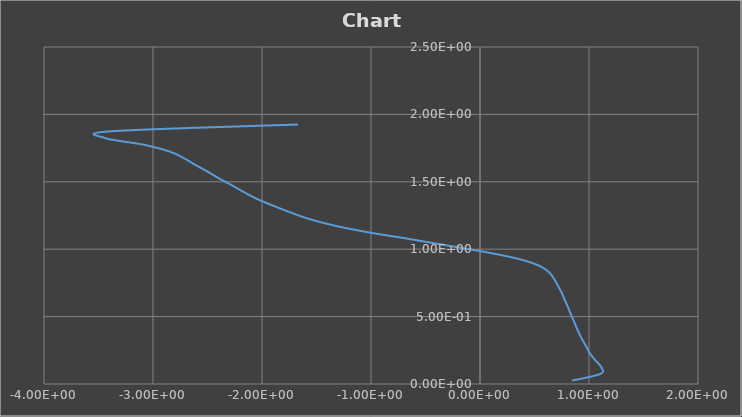
| Category | Series 0 |
|---|---|
| 0.8444 | 0.025 |
| 1.106 | 0.075 |
| 1.113 | 0.125 |
| 1.059 | 0.175 |
| 1.01 | 0.225 |
| 0.9769 | 0.275 |
| 0.9414 | 0.325 |
| 0.9095 | 0.375 |
| 0.8822 | 0.425 |
| 0.8566 | 0.475 |
| 0.8299 | 0.525 |
| 0.8045 | 0.575 |
| 0.7765 | 0.625 |
| 0.7507 | 0.675 |
| 0.7172 | 0.725 |
| 0.6835 | 0.775 |
| 0.638 | 0.825 |
| 0.5493 | 0.875 |
| 0.3674 | 0.925 |
| 0.07627 | 0.975 |
| -0.2831 | 1.025 |
| -0.6416 | 1.075 |
| -1.023 | 1.125 |
| -1.336 | 1.175 |
| -1.571 | 1.225 |
| -1.746 | 1.275 |
| -1.905 | 1.325 |
| -2.052 | 1.375 |
| -2.169 | 1.425 |
| -2.278 | 1.475 |
| -2.394 | 1.525 |
| -2.498 | 1.575 |
| -2.611 | 1.625 |
| -2.716 | 1.675 |
| -2.849 | 1.725 |
| -3.085 | 1.775 |
| -3.442 | 1.825 |
| -3.383 | 1.875 |
| -1.669 | 1.925 |